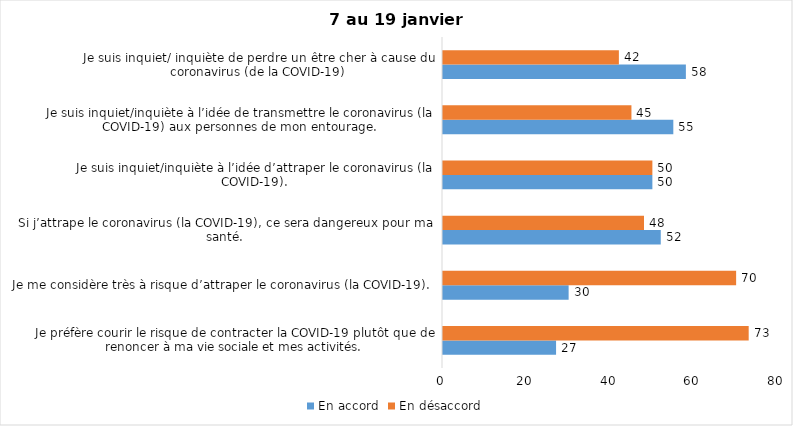
| Category | En accord | En désaccord |
|---|---|---|
| Je préfère courir le risque de contracter la COVID-19 plutôt que de renoncer à ma vie sociale et mes activités. | 27 | 73 |
| Je me considère très à risque d’attraper le coronavirus (la COVID-19). | 30 | 70 |
| Si j’attrape le coronavirus (la COVID-19), ce sera dangereux pour ma santé. | 52 | 48 |
| Je suis inquiet/inquiète à l’idée d’attraper le coronavirus (la COVID-19). | 50 | 50 |
| Je suis inquiet/inquiète à l’idée de transmettre le coronavirus (la COVID-19) aux personnes de mon entourage. | 55 | 45 |
| Je suis inquiet/ inquiète de perdre un être cher à cause du coronavirus (de la COVID-19) | 58 | 42 |